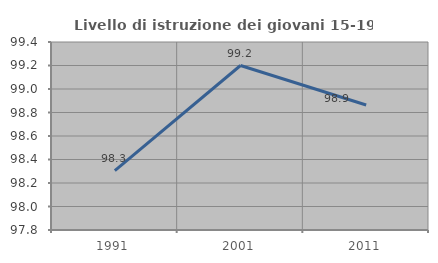
| Category | Livello di istruzione dei giovani 15-19 anni |
|---|---|
| 1991.0 | 98.305 |
| 2001.0 | 99.2 |
| 2011.0 | 98.864 |